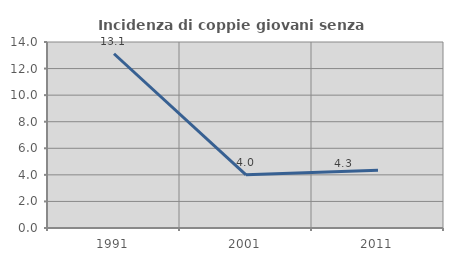
| Category | Incidenza di coppie giovani senza figli |
|---|---|
| 1991.0 | 13.115 |
| 2001.0 | 4 |
| 2011.0 | 4.348 |